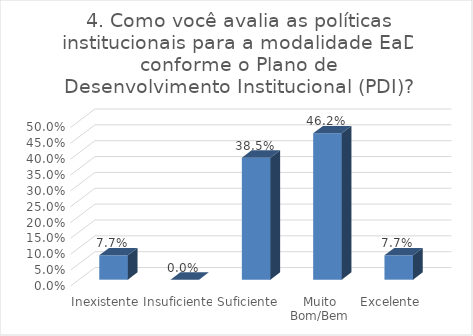
| Category | 4. Como você avalia as políticas institucionais para a modalidade EaD conforme o Plano de Desenvolvimento Institucional (PDI)? |
|---|---|
| Inexistente | 0.077 |
| Insuficiente | 0 |
| Suficiente | 0.385 |
| Muito Bom/Bem | 0.462 |
| Excelente | 0.077 |